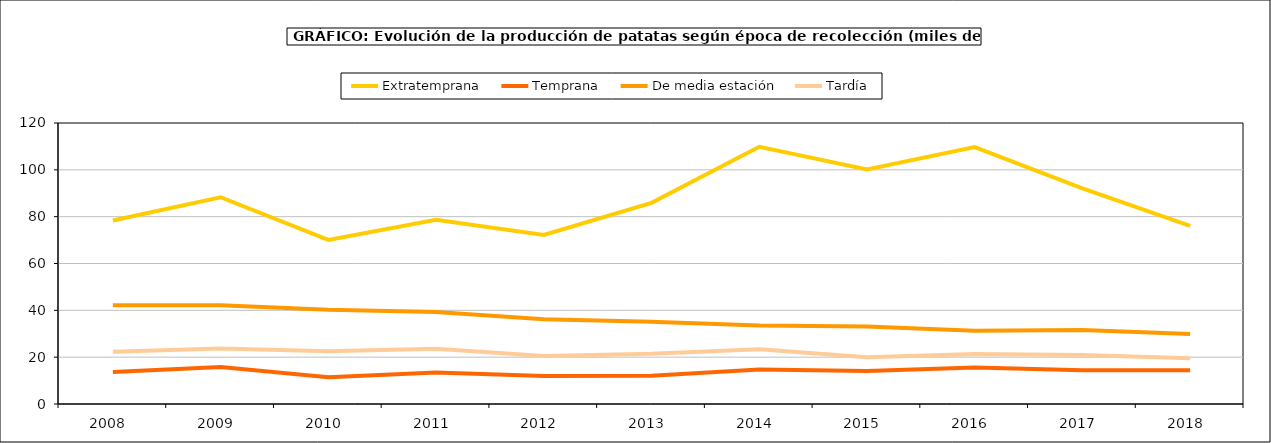
| Category | Extratemprana | Temprana | De media estación | Tardía |
|---|---|---|---|---|
| 2008.0 | 78.383 | 13.629 | 42.134 | 22.278 |
| 2009.0 | 88.296 | 15.804 | 42.188 | 23.661 |
| 2010.0 | 70.07 | 11.444 | 40.198 | 22.492 |
| 2011.0 | 78.631 | 13.439 | 39.332 | 23.623 |
| 2012.0 | 72.219 | 12.004 | 36.224 | 20.486 |
| 2013.0 | 85.916 | 12.091 | 35.096 | 21.424 |
| 2014.0 | 109.861 | 14.725 | 33.547 | 23.388 |
| 2015.0 | 100.12 | 14.085 | 33.109 | 20.017 |
| 2016.0 | 109.713 | 15.55 | 31.323 | 21.344 |
| 2017.0 | 92.094 | 14.433 | 31.633 | 20.895 |
| 2018.0 | 76.034 | 14.386 | 29.899 | 19.556 |